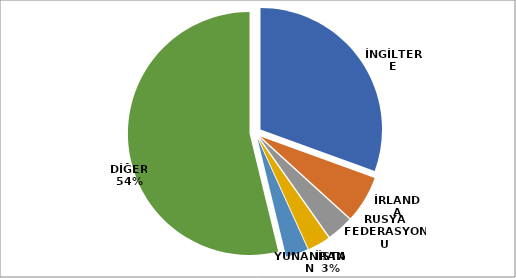
| Category | Series 0 |
|---|---|
| İNGİLTERE | 7207 |
| İRLANDA | 1468 |
| RUSYA FEDERASYONU | 819 |
| İRAN | 707 |
| YUNANİSTAN | 705 |
| DİĞER | 12697 |